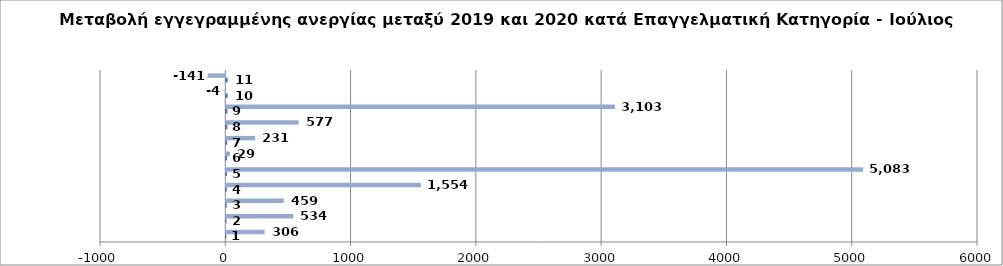
| Category | Series 0 | Series 1 |
|---|---|---|
| 0 | 1 | 306 |
| 1 | 2 | 534 |
| 2 | 3 | 459 |
| 3 | 4 | 1554 |
| 4 | 5 | 5083 |
| 5 | 6 | 29 |
| 6 | 7 | 231 |
| 7 | 8 | 577 |
| 8 | 9 | 3103 |
| 9 | 10 | -4 |
| 10 | 11 | -141 |